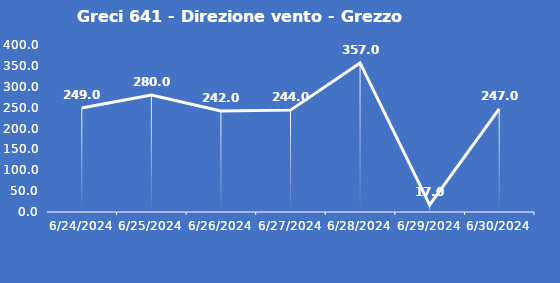
| Category | Greci 641 - Direzione vento - Grezzo (°N) |
|---|---|
| 6/24/24 | 249 |
| 6/25/24 | 280 |
| 6/26/24 | 242 |
| 6/27/24 | 244 |
| 6/28/24 | 357 |
| 6/29/24 | 17 |
| 6/30/24 | 247 |